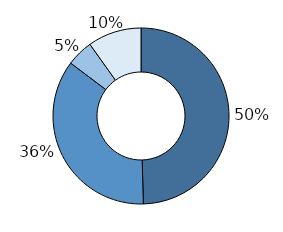
| Category | Series 0 |
|---|---|
| Single no child dependant(s) | 0.496 |
| Single with child dependant(s) | 0.357 |
| Couple no child dependant(s) | 0.049 |
| Couple with child dependant(s) | 0.099 |